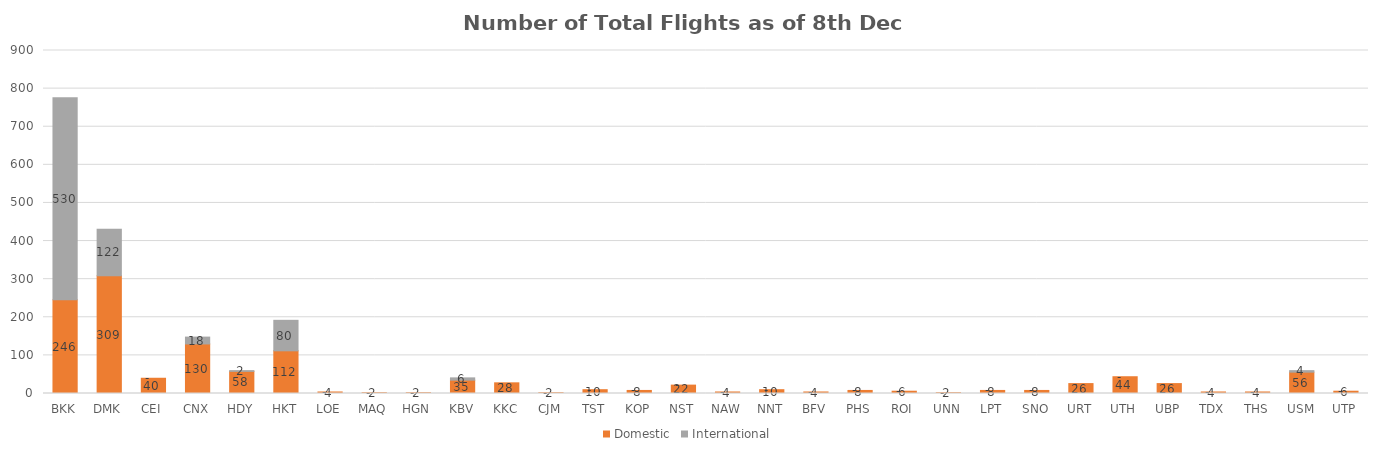
| Category | Domestic | International |
|---|---|---|
| BKK | 246 | 530 |
| DMK | 309 | 122 |
| CEI | 40 | 0 |
| CNX | 130 | 18 |
| HDY | 58 | 2 |
| HKT | 112 | 80 |
| LOE | 4 | 0 |
| MAQ | 2 | 0 |
| HGN | 2 | 0 |
| KBV | 35 | 6 |
| KKC | 28 | 0 |
| CJM | 2 | 0 |
| TST | 10 | 0 |
| KOP | 8 | 0 |
| NST | 22 | 0 |
| NAW | 4 | 0 |
| NNT | 10 | 0 |
| BFV | 4 | 0 |
| PHS | 8 | 0 |
| ROI | 6 | 0 |
| UNN | 2 | 0 |
| LPT | 8 | 0 |
| SNO | 8 | 0 |
| URT | 26 | 0 |
| UTH | 44 | 0 |
| UBP | 26 | 0 |
| TDX | 4 | 0 |
| THS | 4 | 0 |
| USM | 56 | 4 |
| UTP | 6 | 0 |